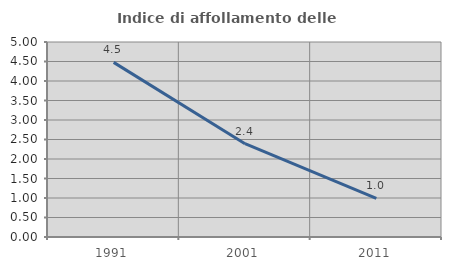
| Category | Indice di affollamento delle abitazioni  |
|---|---|
| 1991.0 | 4.478 |
| 2001.0 | 2.391 |
| 2011.0 | 0.993 |